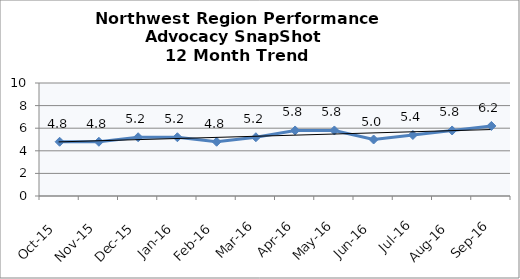
| Category | Northwest Region |
|---|---|
| Oct-15 | 4.8 |
| Nov-15 | 4.8 |
| Dec-15 | 5.2 |
| Jan-16 | 5.2 |
| Feb-16 | 4.8 |
| Mar-16 | 5.2 |
| Apr-16 | 5.8 |
| May-16 | 5.8 |
| Jun-16 | 5 |
| Jul-16 | 5.4 |
| Aug-16 | 5.8 |
| Sep-16 | 6.2 |